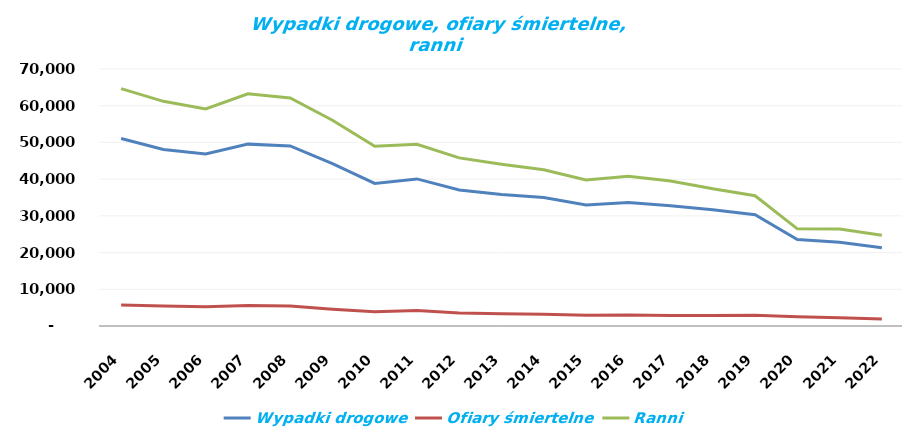
| Category | Wypadki drogowe | Ofiary śmiertelne | Ranni |
|---|---|---|---|
| 2004.0 | 51069 | 5712 | 64661 |
| 2005.0 | 48100 | 5444 | 61191 |
| 2006.0 | 46876 | 5243 | 59123 |
| 2007.0 | 49536 | 5583 | 63224 |
| 2008.0 | 49054 | 5437 | 62097 |
| 2009.0 | 44196 | 4572 | 56046 |
| 2010.0 | 38832 | 3907 | 48952 |
| 2011.0 | 40065 | 4189 | 49501 |
| 2012.0 | 37046 | 3571 | 45792 |
| 2013.0 | 35847 | 3357 | 44059 |
| 2014.0 | 34970 | 3202 | 42545 |
| 2015.0 | 32967 | 2938 | 39778 |
| 2016.0 | 33664 | 3026 | 40766 |
| 2017.0 | 32760 | 2831 | 39466 |
| 2018.0 | 31674 | 2862 | 37359 |
| 2019.0 | 30288 | 2909 | 35477 |
| 2020.0 | 23540 | 2491 | 26463 |
| 2021.0 | 22816 | 2245 | 26415 |
| 2022.0 | 21322 | 1896 | 24743 |